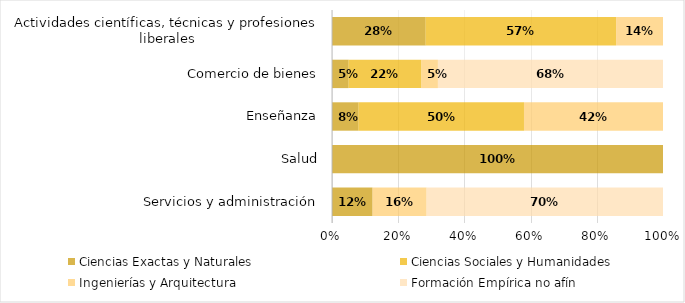
| Category | Ciencias Exactas y Naturales | Ciencias Sociales y Humanidades | Ingenierías y Arquitectura | Formación Empírica no afín |
|---|---|---|---|---|
| Servicios y administración | 0.12 | 0 | 0.16 | 0.7 |
| Salud | 1 | 0 | 0 | 0 |
| Enseñanza | 0.08 | 0.5 | 0.42 | 0 |
| Comercio de bienes | 0.05 | 0.22 | 0.05 | 0.68 |
| Actividades científicas, técnicas y profesiones liberales | 0.28 | 0.57 | 0.14 | 0 |